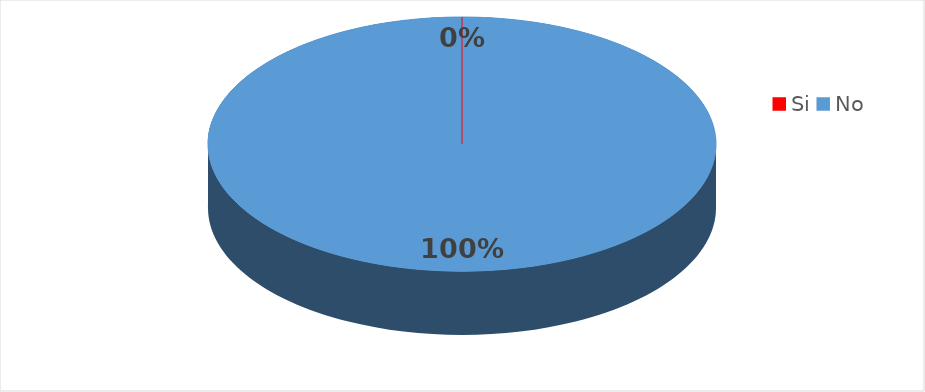
| Category | Series 0 |
|---|---|
| Si | 0 |
| No | 6 |